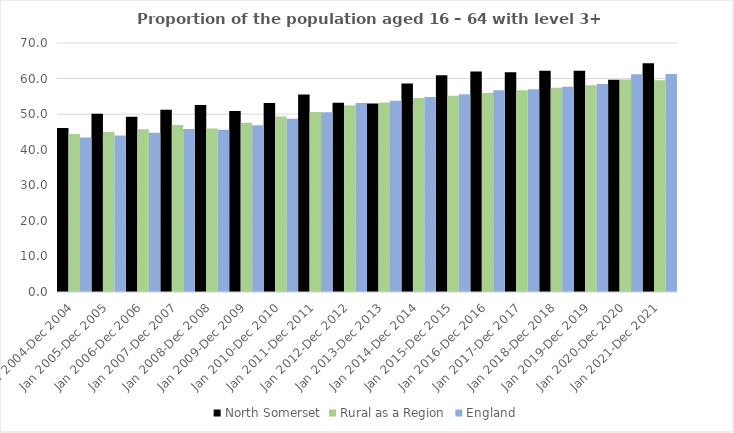
| Category | North Somerset | Rural as a Region | England |
|---|---|---|---|
| Jan 2004-Dec 2004 | 46.1 | 44.405 | 43.4 |
| Jan 2005-Dec 2005 | 50.1 | 44.973 | 44 |
| Jan 2006-Dec 2006 | 49.3 | 45.774 | 44.8 |
| Jan 2007-Dec 2007 | 51.2 | 46.968 | 45.8 |
| Jan 2008-Dec 2008 | 52.6 | 45.964 | 45.6 |
| Jan 2009-Dec 2009 | 50.9 | 47.59 | 46.9 |
| Jan 2010-Dec 2010 | 53.1 | 49.362 | 48.7 |
| Jan 2011-Dec 2011 | 55.5 | 50.602 | 50.5 |
| Jan 2012-Dec 2012 | 53.2 | 52.439 | 53.1 |
| Jan 2013-Dec 2013 | 53 | 53.276 | 53.8 |
| Jan 2014-Dec 2014 | 58.6 | 54.57 | 54.8 |
| Jan 2015-Dec 2015 | 60.9 | 55.16 | 55.6 |
| Jan 2016-Dec 2016 | 62 | 55.941 | 56.7 |
| Jan 2017-Dec 2017 | 61.8 | 56.689 | 57 |
| Jan 2018-Dec 2018 | 62.2 | 57.389 | 57.7 |
| Jan 2019-Dec 2019 | 62.2 | 58.147 | 58.5 |
| Jan 2020-Dec 2020 | 59.7 | 59.771 | 61.2 |
| Jan 2021-Dec 2021 | 64.3 | 59.54 | 61.3 |